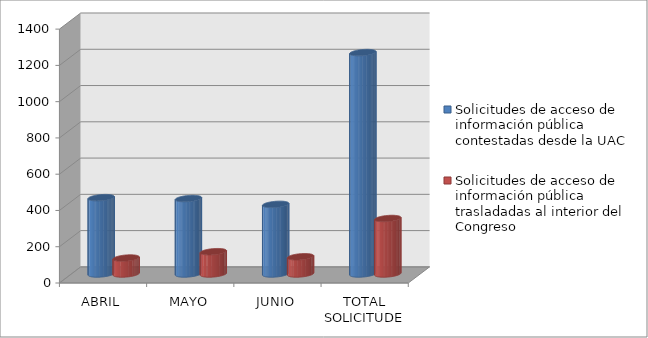
| Category | Solicitudes de acceso de información pública contestadas desde la UAC | Solicitudes de acceso de información pública trasladadas al interior del Congreso |
|---|---|---|
| ABRIL | 421 | 88 |
| MAYO | 416 | 123 |
| JUNIO | 384 | 95 |
| TOTAL SOLICITUDES | 1221 | 306 |